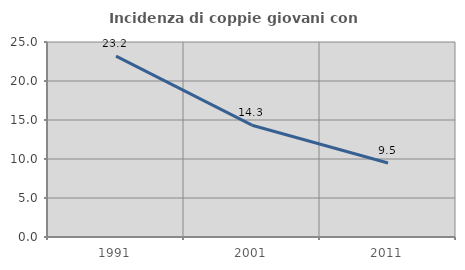
| Category | Incidenza di coppie giovani con figli |
|---|---|
| 1991.0 | 23.184 |
| 2001.0 | 14.332 |
| 2011.0 | 9.48 |